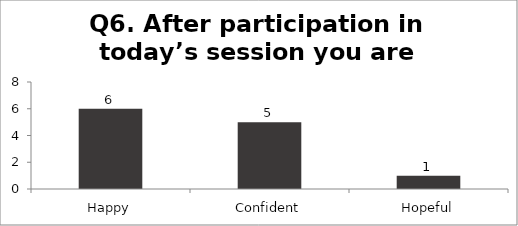
| Category | Q6. After participation in today’s session you are feeling? |
|---|---|
| Happy | 6 |
| Confident | 5 |
| Hopeful | 1 |